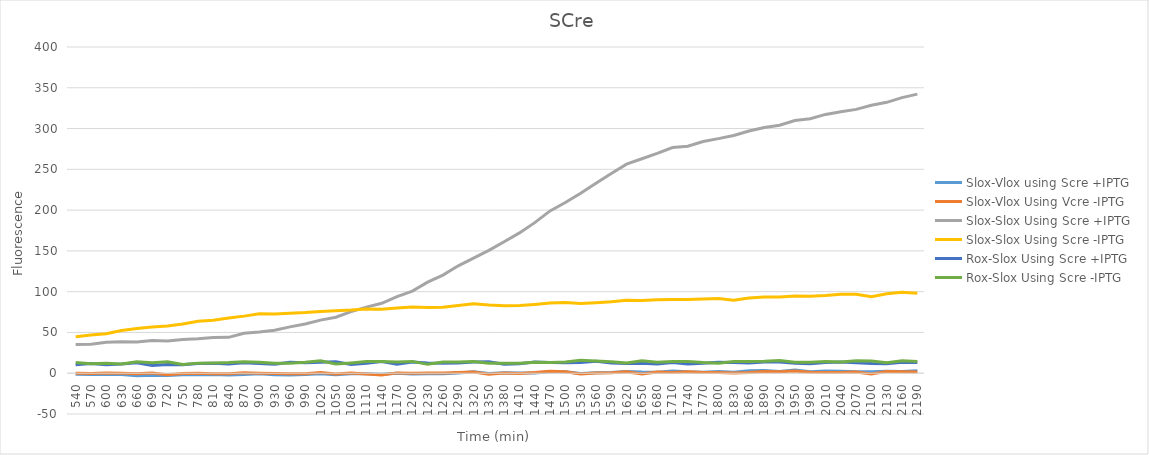
| Category | Slox-Vlox using Scre +IPTG | Slox-Vlox Using Vcre -IPTG | Slox-Slox Using Scre +IPTG | Slox-Slox Using Scre -IPTG | Rox-Slox Using Scre +IPTG | Rox-Slox Using Scre -IPTG |
|---|---|---|---|---|---|---|
| 540.0 | -1.333 | 0.083 | 35.083 | 44.833 | 10.5 | 13.25 |
| 570.0 | -1.458 | -0.458 | 35.625 | 46.792 | 12 | 11.5 |
| 600.0 | -1.583 | 0.417 | 38 | 48.333 | 10.5 | 12.25 |
| 630.0 | -1.708 | 0.042 | 38.458 | 52.458 | 11.25 | 11.25 |
| 660.0 | -3.125 | -0.792 | 38.208 | 54.958 | 12.875 | 14.125 |
| 690.0 | -2.458 | 0.125 | 40.042 | 56.792 | 9.5 | 12.75 |
| 720.0 | -2.875 | -1.875 | 39.542 | 57.875 | 10.625 | 14.125 |
| 750.0 | -1.958 | -0.375 | 41.208 | 60.458 | 10.5 | 10.75 |
| 780.0 | -1.917 | -0.083 | 42.25 | 63.833 | 11.875 | 12.375 |
| 810.0 | -1.5 | -0.583 | 43.833 | 64.833 | 12.25 | 12.5 |
| 840.0 | -2.167 | -0.5 | 44 | 67.583 | 11.25 | 13 |
| 870.0 | -1.583 | 0.667 | 49 | 70 | 12.75 | 14 |
| 900.0 | -0.5 | 0 | 50.5 | 73 | 12 | 13.5 |
| 930.0 | -1.875 | -0.292 | 52.792 | 72.625 | 10.875 | 12.125 |
| 960.0 | -2.167 | -0.667 | 56.833 | 73.667 | 13.375 | 12.375 |
| 990.0 | -1.708 | -0.542 | 60.458 | 74.375 | 12.75 | 13.5 |
| 1020.0 | -0.542 | 0.792 | 65.125 | 75.625 | 13.375 | 15.375 |
| 1050.0 | -1.75 | -1.083 | 68.667 | 76.583 | 14.125 | 11.375 |
| 1080.0 | -0.75 | 0.167 | 75.5 | 77.5 | 10.625 | 12.625 |
| 1110.0 | -0.75 | -0.833 | 81 | 78.833 | 12.25 | 14.25 |
| 1140.0 | -1.208 | -2.125 | 85.792 | 78.542 | 14.25 | 14.5 |
| 1170.0 | 0.083 | 0.417 | 93.917 | 79.917 | 11.125 | 13.875 |
| 1200.0 | -0.875 | -0.042 | 100.708 | 81.125 | 13.75 | 14.5 |
| 1230.0 | -0.542 | 0.125 | 111.708 | 80.542 | 12.625 | 10.875 |
| 1260.0 | -0.667 | 0.167 | 120.25 | 80.917 | 12.375 | 13.625 |
| 1290.0 | 0.417 | 1 | 131.667 | 83.167 | 12.5 | 13.75 |
| 1320.0 | 1.75 | 1.417 | 141.167 | 85.25 | 13.625 | 14.375 |
| 1350.0 | -0.208 | -1.375 | 150.625 | 83.542 | 14.125 | 12.375 |
| 1380.0 | 0.458 | 0.375 | 161.208 | 82.875 | 11 | 12.25 |
| 1410.0 | 0.333 | -0.25 | 172.083 | 83 | 11.625 | 12.125 |
| 1440.0 | 0.292 | 0.792 | 184.625 | 84.375 | 13.875 | 13.375 |
| 1470.0 | 1.875 | 2.292 | 199.042 | 85.958 | 13.125 | 13.125 |
| 1500.0 | 1.667 | 1.917 | 209.25 | 86.667 | 12.875 | 13.875 |
| 1530.0 | -0.417 | -1.083 | 220.667 | 85.417 | 13 | 16 |
| 1560.0 | 0.5 | 0.333 | 233 | 86.5 | 14.75 | 15 |
| 1590.0 | 0.917 | 0.583 | 245 | 87.5 | 12.625 | 14.125 |
| 1620.0 | 2.125 | 1.792 | 256.375 | 89.458 | 12 | 12.5 |
| 1650.0 | 1.458 | -0.792 | 262.958 | 89.125 | 12.125 | 15.375 |
| 1680.0 | 1.208 | 1.542 | 269.458 | 90.125 | 11.375 | 13.375 |
| 1710.0 | 2.708 | 0.792 | 276.708 | 90.375 | 13.125 | 14.375 |
| 1740.0 | 1.667 | 1.833 | 278.25 | 90.5 | 11.25 | 14.5 |
| 1770.0 | 1.083 | 0.833 | 284.083 | 90.917 | 12.25 | 13 |
| 1800.0 | 2 | 1 | 287.667 | 91.667 | 13.375 | 12.375 |
| 1830.0 | 1.25 | 0.417 | 291.417 | 89.583 | 13.25 | 14.5 |
| 1860.0 | 3.042 | 0.958 | 297.042 | 92.292 | 12.625 | 14.375 |
| 1890.0 | 3.25 | 2.25 | 301.333 | 93.583 | 13.75 | 14.75 |
| 1920.0 | 2.042 | 1.792 | 304.125 | 93.458 | 13.625 | 15.625 |
| 1950.0 | 4.083 | 2.583 | 309.917 | 94.75 | 12.375 | 13.375 |
| 1980.0 | 1.958 | 1.125 | 312.125 | 94.458 | 11.75 | 13.5 |
| 2010.0 | 2.667 | 0.833 | 317.333 | 95.333 | 13 | 14.5 |
| 2040.0 | 2.542 | 0.958 | 320.542 | 96.792 | 13.625 | 13.875 |
| 2070.0 | 1.667 | 1.5 | 323.5 | 96.917 | 12.875 | 15.375 |
| 2100.0 | 1.917 | -0.833 | 328.583 | 93.75 | 12 | 15 |
| 2130.0 | 2.5 | 2.25 | 332.167 | 97.333 | 11.75 | 13 |
| 2160.0 | 2.125 | 1.875 | 337.958 | 99.208 | 13.375 | 15.375 |
| 2190.0 | 3.167 | 1.417 | 342.25 | 97.917 | 13 | 14.25 |